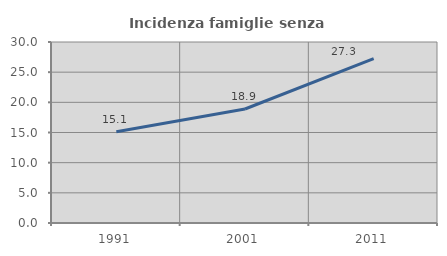
| Category | Incidenza famiglie senza nuclei |
|---|---|
| 1991.0 | 15.137 |
| 2001.0 | 18.895 |
| 2011.0 | 27.261 |